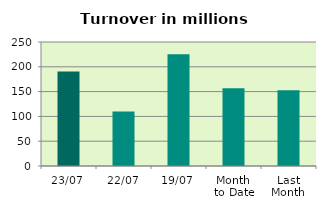
| Category | Series 0 |
|---|---|
| 23/07 | 190.29 |
| 22/07 | 109.987 |
| 19/07 | 225.544 |
| Month 
to Date | 156.799 |
| Last
Month | 152.535 |